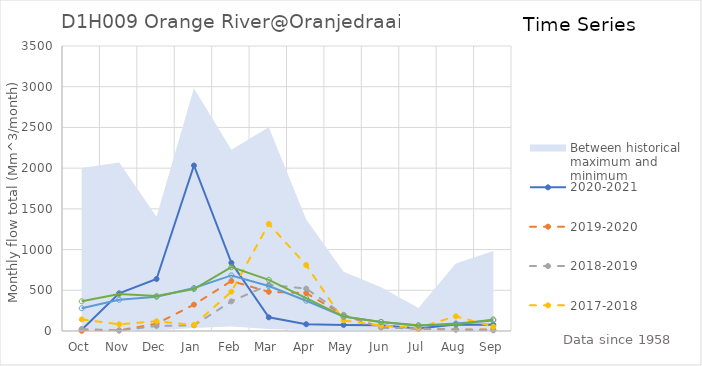
| Category | 2020-2021 | 2019-2020 | 2018-2019 | 2017-2018 | Mean total series | Mean 1961-1990 |
|---|---|---|---|---|---|---|
| Oct | 14.604 | 2.158 | 25.135 | 142.581 | 279.626 | 365.06 |
| Nov | 463.101 | 7.342 | 6.331 | 82.412 | 384.337 | 454.516 |
| Dec | 638.696 | 89.514 | 61.236 | 119.776 | 419.607 | 429.257 |
| Jan | 2032.304 | 323.668 | 68.957 | 73.594 | 528.594 | 515.566 |
| Feb | 836.623 | 613.991 | 363.87 | 482.85 | 682.53 | 783.897 |
| Mar | 167.822 | 481.356 | 567.198 | 1315.322 | 552.935 | 628.256 |
| Apr | 83.195 | 465.285 | 520.724 | 809.018 | 371.747 | 404.366 |
| May | 74.661 | 194.457 | 199.598 | 129.644 | 176.596 | 177.521 |
| Jun | 70.977 | 43.977 | 42.57 | 65.701 | 111.67 | 111.719 |
| Jul | 30.844 | 29.578 | 28.661 | 42.612 | 65.337 | 71.836 |
| Aug | 79.994 | 17.289 | 16.574 | 179.992 | 92.013 | 78.599 |
| Sep | 76.145 | 17.477 | 7.812 | 54.119 | 129.254 | 142.507 |